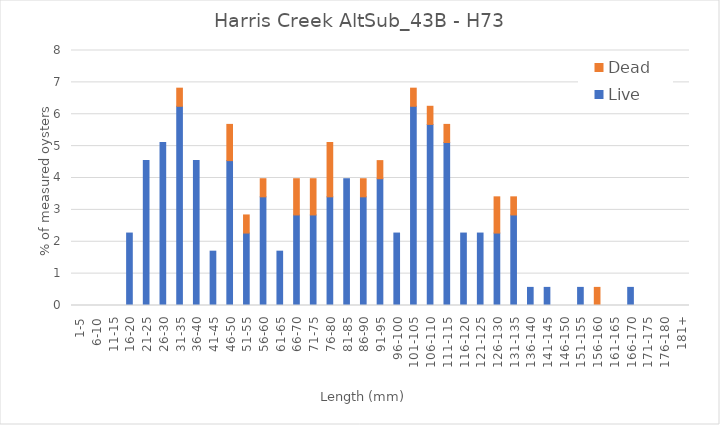
| Category | Live | Dead |
|---|---|---|
| 1-5 | 0 | 0 |
| 6-10 | 0 | 0 |
| 11-15 | 0 | 0 |
| 16-20 | 2.273 | 0 |
| 21-25 | 4.545 | 0 |
| 26-30 | 5.114 | 0 |
| 31-35 | 6.25 | 0.568 |
| 36-40 | 4.545 | 0 |
| 41-45 | 1.705 | 0 |
| 46-50 | 4.545 | 1.136 |
| 51-55 | 2.273 | 0.568 |
| 56-60 | 3.409 | 0.568 |
| 61-65 | 1.705 | 0 |
| 66-70 | 2.841 | 1.136 |
| 71-75 | 2.841 | 1.136 |
| 76-80 | 3.409 | 1.705 |
| 81-85 | 3.977 | 0 |
| 86-90 | 3.409 | 0.568 |
| 91-95 | 3.977 | 0.568 |
| 96-100 | 2.273 | 0 |
| 101-105 | 6.25 | 0.568 |
| 106-110 | 5.682 | 0.568 |
| 111-115 | 5.114 | 0.568 |
| 116-120 | 2.273 | 0 |
| 121-125 | 2.273 | 0 |
| 126-130 | 2.273 | 1.136 |
| 131-135 | 2.841 | 0.568 |
| 136-140 | 0.568 | 0 |
| 141-145 | 0.568 | 0 |
| 146-150 | 0 | 0 |
| 151-155 | 0.568 | 0 |
| 156-160 | 0 | 0.568 |
| 161-165 | 0 | 0 |
| 166-170 | 0.568 | 0 |
| 171-175 | 0 | 0 |
| 176-180 | 0 | 0 |
| 181+ | 0 | 0 |